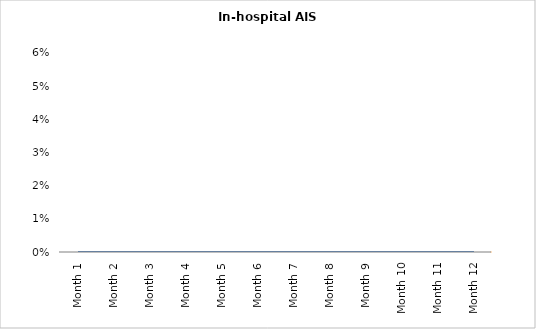
| Category | In-hospital AIS mortality |
|---|---|
| Month 1 | 0 |
| Month 2 | 0 |
| Month 3 | 0 |
| Month 4 | 0 |
| Month 5 | 0 |
| Month 6 | 0 |
| Month 7 | 0 |
| Month 8 | 0 |
| Month 9 | 0 |
| Month 10 | 0 |
| Month 11 | 0 |
| Month 12 | 0 |